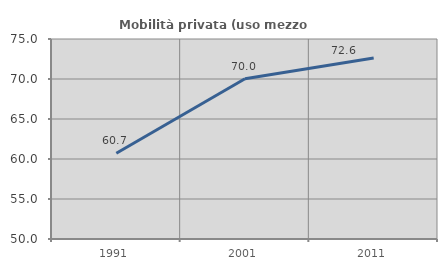
| Category | Mobilità privata (uso mezzo privato) |
|---|---|
| 1991.0 | 60.712 |
| 2001.0 | 70.036 |
| 2011.0 | 72.63 |